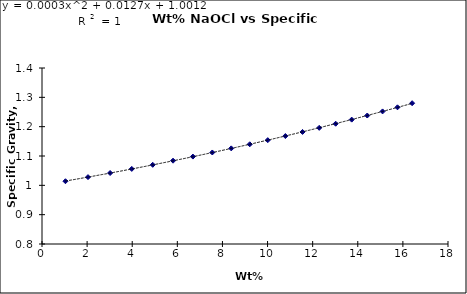
| Category | Series 0 |
|---|---|
| 1.04 | 1.014 |
| 2.04 | 1.028 |
| 3.02 | 1.042 |
| 3.98 | 1.056 |
| 4.91 | 1.07 |
| 5.81 | 1.084 |
| 6.69 | 1.098 |
| 7.55 | 1.112 |
| 8.39 | 1.126 |
| 9.21 | 1.14 |
| 10.01 | 1.154 |
| 10.79 | 1.168 |
| 11.55 | 1.182 |
| 12.29 | 1.196 |
| 13.02 | 1.21 |
| 13.73 | 1.224 |
| 14.42 | 1.238 |
| 15.1 | 1.252 |
| 15.76 | 1.266 |
| 16.41 | 1.28 |